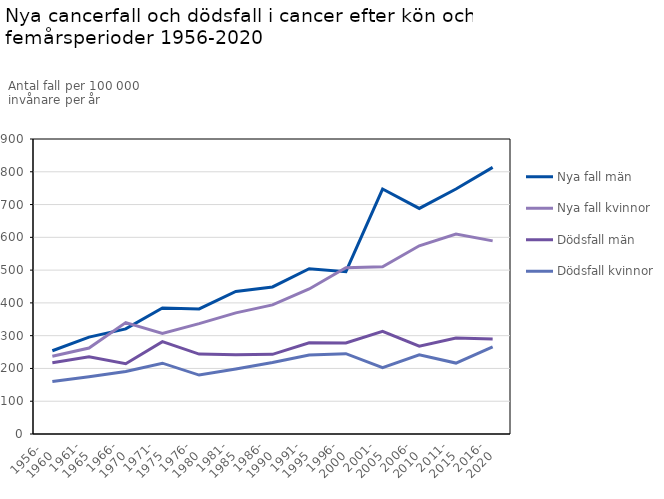
| Category | Nya fall män | Nya fall kvinnor | Dödsfall män | Dödsfall kvinnor |
|---|---|---|---|---|
| 1956- 
1960 | 253.9 | 237.39 | 217.08 | 160.1 |
| 1961-
1965 | 295.7 | 262.41 | 235.79 | 174.94 |
| 1966-
1970 | 320.62 | 339.89 | 214.39 | 190.72 |
| 1971-
1975 | 384.36 | 306.48 | 281.74 | 216.01 |
| 1976-
1980 | 381.72 | 336.57 | 243.73 | 179.74 |
| 1981-
1985 | 435.07 | 369.55 | 241.9 | 198.34 |
| 1986-
1990 | 448.58 | 393.95 | 242.98 | 218.31 |
| 1991-
1995 | 504.1 | 442.47 | 278.07 | 240.92 |
| 1996-
2000 | 495.19 | 507.19 | 277.95 | 245.12 |
| 2001-
2005 | 747.33 | 510.13 | 313.45 | 202.55 |
| 2006-
2010 | 688.17 | 574.2 | 268.2 | 241.31 |
| 2011-
2015 | 747.46 | 610.13 | 293.09 | 216.41 |
| 2016-
2020 | 813.31 | 589.27 | 290.08 | 265.65 |